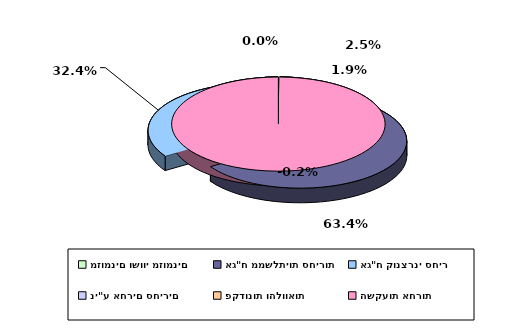
| Category | Series 0 |
|---|---|
| מזומנים ושווי מזומנים | 0.025 |
| אג"ח ממשלתיות סחירות | 0.634 |
| אג"ח קונצרני סחיר | 0.324 |
| ני"ע אחרים סחירים | 0.019 |
| פקדונות והלוואות | 0 |
| השקעות אחרות | -0.002 |